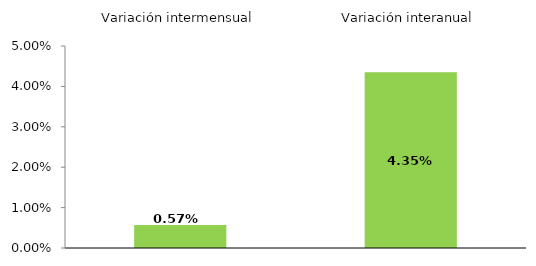
| Category | Series 0 |
|---|---|
| 0 | 0.571 |
| 1 | 4.349 |